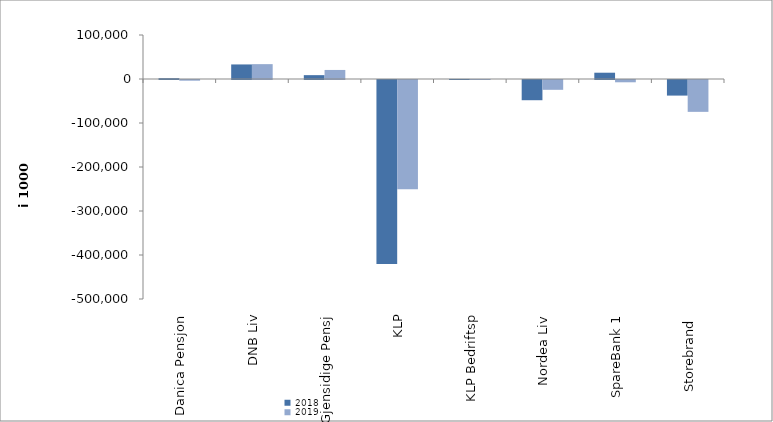
| Category | 2018 | 2019 |
|---|---|---|
| Danica Pensjon | 1918.378 | -1576.891 |
| DNB Liv | 33099 | 33779 |
| Gjensidige Pensj | 8758 | 20554 |
| KLP | -418198.021 | -248299.767 |
| KLP Bedriftsp | 163 | -14 |
| Nordea Liv | -45945.832 | -22302.415 |
| SpareBank 1 | 14295.353 | -5187.327 |
| Storebrand  | -35442.452 | -72397.951 |